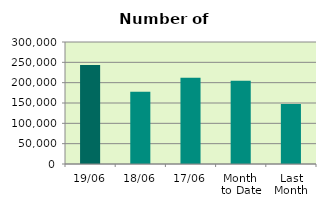
| Category | Series 0 |
|---|---|
| 19/06 | 243590 |
| 18/06 | 177498 |
| 17/06 | 211954 |
| Month 
to Date | 204863.067 |
| Last
Month | 147277.8 |